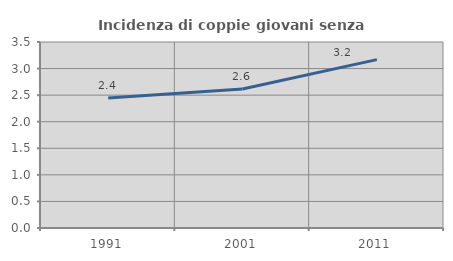
| Category | Incidenza di coppie giovani senza figli |
|---|---|
| 1991.0 | 2.448 |
| 2001.0 | 2.615 |
| 2011.0 | 3.169 |